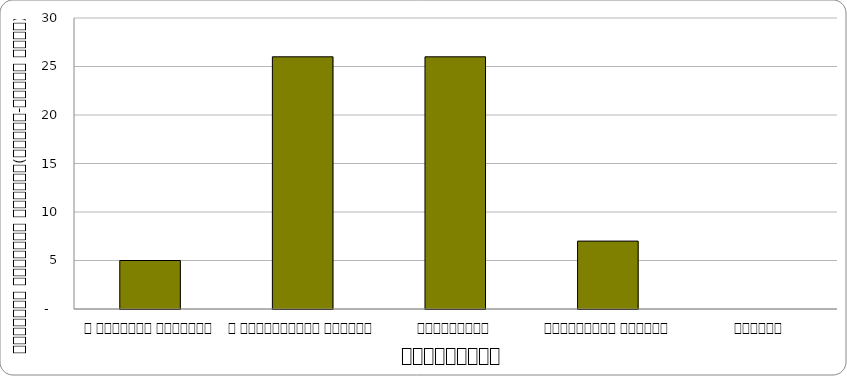
| Category | स्वास्थ्य  |
|---|---|
| द हिमालयन टाइम्स् | 5 |
| द काठमाण्डौं पोस्ट् | 26 |
| कान्तिपुर | 26 |
| अन्नपूर्ण पोस्ट् | 7 |
| नागरिक | 0 |